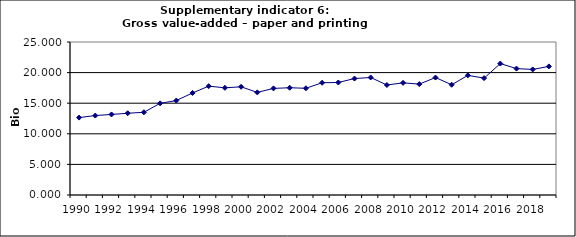
| Category | Gross value-added – paper and printing industry, Bio Euro (EC95) |
|---|---|
| 1990 | 12.648 |
| 1991 | 12.982 |
| 1992 | 13.16 |
| 1993 | 13.356 |
| 1994 | 13.518 |
| 1995 | 14.977 |
| 1996 | 15.431 |
| 1997 | 16.672 |
| 1998 | 17.786 |
| 1999 | 17.513 |
| 2000 | 17.679 |
| 2001 | 16.768 |
| 2002 | 17.418 |
| 2003 | 17.525 |
| 2004 | 17.436 |
| 2005 | 18.34 |
| 2006 | 18.386 |
| 2007 | 19.029 |
| 2008 | 19.2 |
| 2009 | 17.973 |
| 2010 | 18.324 |
| 2011 | 18.117 |
| 2012 | 19.19 |
| 2013 | 18.015 |
| 2014 | 19.551 |
| 2015 | 19.093 |
| 2016 | 21.476 |
| 2017 | 20.655 |
| 2018 | 20.516 |
| 2019 | 21.01 |